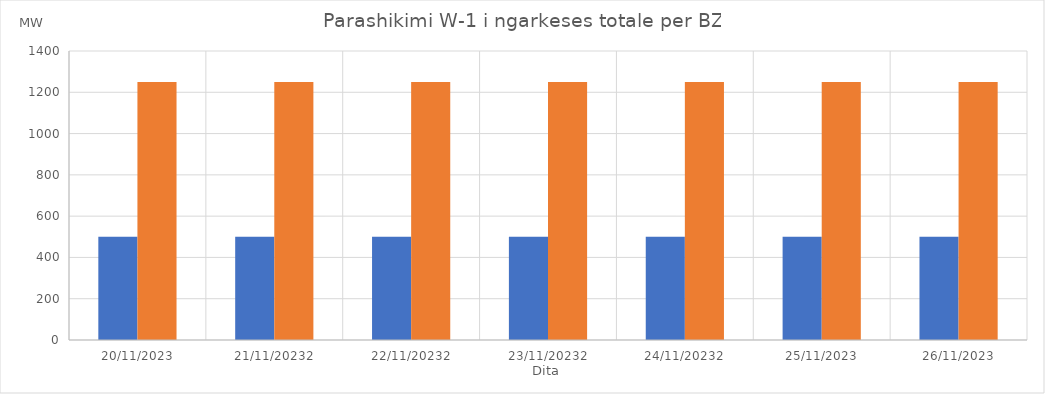
| Category | Min (MW) | Max (MW) |
|---|---|---|
| 20/11/2023 | 500 | 1250 |
| 21/11/20232 | 500 | 1250 |
| 22/11/20232 | 500 | 1250 |
| 23/11/20232 | 500 | 1250 |
| 24/11/20232 | 500 | 1250 |
| 25/11/2023 | 500 | 1250 |
| 26/11/2023 | 500 | 1250 |